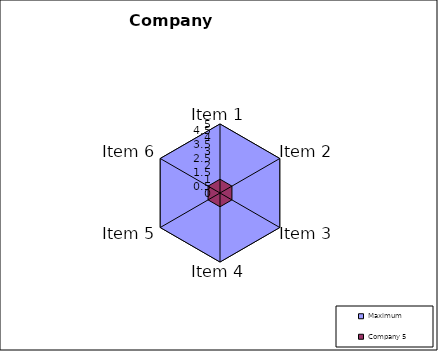
| Category | Maximum | Company 5 |
|---|---|---|
| Item 1 | 5 | 1 |
| Item 2 | 5 | 1 |
| Item 3 | 5 | 1 |
| Item 4 | 5 | 1 |
| Item 5 | 5 | 1 |
| Item 6 | 5 | 1 |